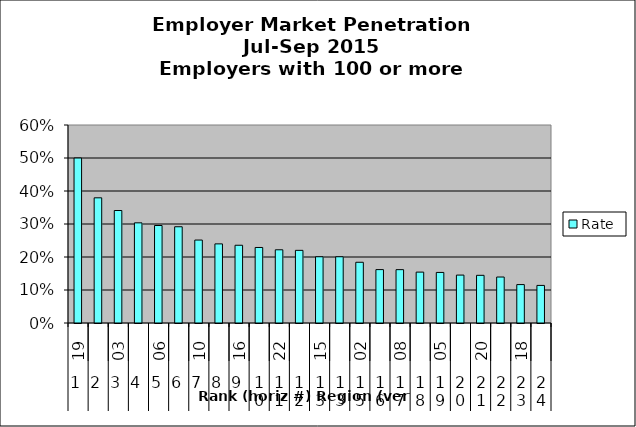
| Category | Rate |
|---|---|
| 0 | 0.5 |
| 1 | 0.379 |
| 2 | 0.341 |
| 3 | 0.304 |
| 4 | 0.295 |
| 5 | 0.292 |
| 6 | 0.251 |
| 7 | 0.24 |
| 8 | 0.236 |
| 9 | 0.229 |
| 10 | 0.222 |
| 11 | 0.22 |
| 12 | 0.201 |
| 13 | 0.201 |
| 14 | 0.184 |
| 15 | 0.162 |
| 16 | 0.162 |
| 17 | 0.154 |
| 18 | 0.153 |
| 19 | 0.145 |
| 20 | 0.144 |
| 21 | 0.139 |
| 22 | 0.116 |
| 23 | 0.114 |